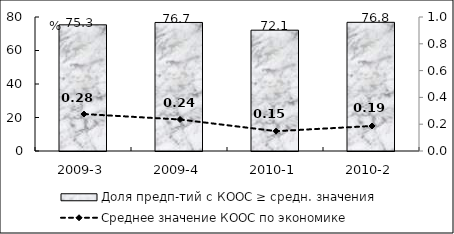
| Category | Доля предп-тий с КООС ≥ средн. значения  |
|---|---|
| 2009-3 | 75.32 |
| 2009-4 | 76.74 |
| 2010-1 | 72.13 |
| 2010-2 | 76.82 |